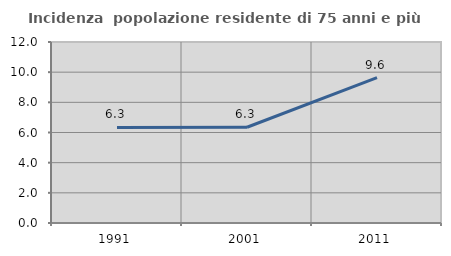
| Category | Incidenza  popolazione residente di 75 anni e più |
|---|---|
| 1991.0 | 6.339 |
| 2001.0 | 6.347 |
| 2011.0 | 9.639 |